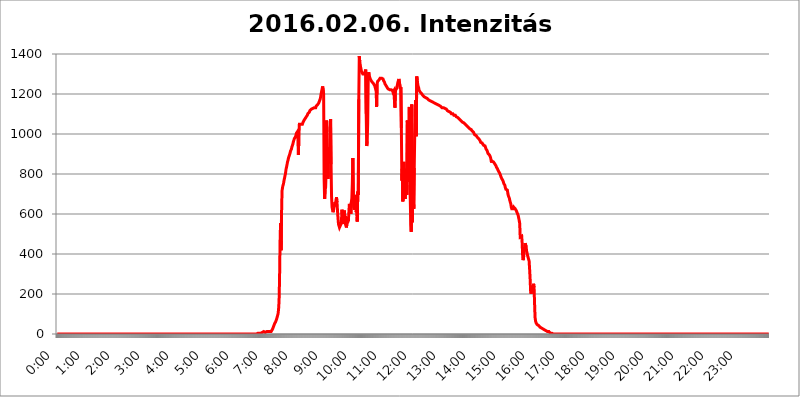
| Category | 2016.02.06. Intenzitás [W/m^2] |
|---|---|
| 0.0 | 0 |
| 0.0006944444444444445 | 0 |
| 0.001388888888888889 | 0 |
| 0.0020833333333333333 | 0 |
| 0.002777777777777778 | 0 |
| 0.003472222222222222 | 0 |
| 0.004166666666666667 | 0 |
| 0.004861111111111111 | 0 |
| 0.005555555555555556 | 0 |
| 0.0062499999999999995 | 0 |
| 0.006944444444444444 | 0 |
| 0.007638888888888889 | 0 |
| 0.008333333333333333 | 0 |
| 0.009027777777777779 | 0 |
| 0.009722222222222222 | 0 |
| 0.010416666666666666 | 0 |
| 0.011111111111111112 | 0 |
| 0.011805555555555555 | 0 |
| 0.012499999999999999 | 0 |
| 0.013194444444444444 | 0 |
| 0.013888888888888888 | 0 |
| 0.014583333333333332 | 0 |
| 0.015277777777777777 | 0 |
| 0.015972222222222224 | 0 |
| 0.016666666666666666 | 0 |
| 0.017361111111111112 | 0 |
| 0.018055555555555557 | 0 |
| 0.01875 | 0 |
| 0.019444444444444445 | 0 |
| 0.02013888888888889 | 0 |
| 0.020833333333333332 | 0 |
| 0.02152777777777778 | 0 |
| 0.022222222222222223 | 0 |
| 0.02291666666666667 | 0 |
| 0.02361111111111111 | 0 |
| 0.024305555555555556 | 0 |
| 0.024999999999999998 | 0 |
| 0.025694444444444447 | 0 |
| 0.02638888888888889 | 0 |
| 0.027083333333333334 | 0 |
| 0.027777777777777776 | 0 |
| 0.02847222222222222 | 0 |
| 0.029166666666666664 | 0 |
| 0.029861111111111113 | 0 |
| 0.030555555555555555 | 0 |
| 0.03125 | 0 |
| 0.03194444444444445 | 0 |
| 0.03263888888888889 | 0 |
| 0.03333333333333333 | 0 |
| 0.034027777777777775 | 0 |
| 0.034722222222222224 | 0 |
| 0.035416666666666666 | 0 |
| 0.036111111111111115 | 0 |
| 0.03680555555555556 | 0 |
| 0.0375 | 0 |
| 0.03819444444444444 | 0 |
| 0.03888888888888889 | 0 |
| 0.03958333333333333 | 0 |
| 0.04027777777777778 | 0 |
| 0.04097222222222222 | 0 |
| 0.041666666666666664 | 0 |
| 0.042361111111111106 | 0 |
| 0.04305555555555556 | 0 |
| 0.043750000000000004 | 0 |
| 0.044444444444444446 | 0 |
| 0.04513888888888889 | 0 |
| 0.04583333333333334 | 0 |
| 0.04652777777777778 | 0 |
| 0.04722222222222222 | 0 |
| 0.04791666666666666 | 0 |
| 0.04861111111111111 | 0 |
| 0.049305555555555554 | 0 |
| 0.049999999999999996 | 0 |
| 0.05069444444444445 | 0 |
| 0.051388888888888894 | 0 |
| 0.052083333333333336 | 0 |
| 0.05277777777777778 | 0 |
| 0.05347222222222222 | 0 |
| 0.05416666666666667 | 0 |
| 0.05486111111111111 | 0 |
| 0.05555555555555555 | 0 |
| 0.05625 | 0 |
| 0.05694444444444444 | 0 |
| 0.057638888888888885 | 0 |
| 0.05833333333333333 | 0 |
| 0.05902777777777778 | 0 |
| 0.059722222222222225 | 0 |
| 0.06041666666666667 | 0 |
| 0.061111111111111116 | 0 |
| 0.06180555555555556 | 0 |
| 0.0625 | 0 |
| 0.06319444444444444 | 0 |
| 0.06388888888888888 | 0 |
| 0.06458333333333334 | 0 |
| 0.06527777777777778 | 0 |
| 0.06597222222222222 | 0 |
| 0.06666666666666667 | 0 |
| 0.06736111111111111 | 0 |
| 0.06805555555555555 | 0 |
| 0.06874999999999999 | 0 |
| 0.06944444444444443 | 0 |
| 0.07013888888888889 | 0 |
| 0.07083333333333333 | 0 |
| 0.07152777777777779 | 0 |
| 0.07222222222222223 | 0 |
| 0.07291666666666667 | 0 |
| 0.07361111111111111 | 0 |
| 0.07430555555555556 | 0 |
| 0.075 | 0 |
| 0.07569444444444444 | 0 |
| 0.0763888888888889 | 0 |
| 0.07708333333333334 | 0 |
| 0.07777777777777778 | 0 |
| 0.07847222222222222 | 0 |
| 0.07916666666666666 | 0 |
| 0.0798611111111111 | 0 |
| 0.08055555555555556 | 0 |
| 0.08125 | 0 |
| 0.08194444444444444 | 0 |
| 0.08263888888888889 | 0 |
| 0.08333333333333333 | 0 |
| 0.08402777777777777 | 0 |
| 0.08472222222222221 | 0 |
| 0.08541666666666665 | 0 |
| 0.08611111111111112 | 0 |
| 0.08680555555555557 | 0 |
| 0.08750000000000001 | 0 |
| 0.08819444444444445 | 0 |
| 0.08888888888888889 | 0 |
| 0.08958333333333333 | 0 |
| 0.09027777777777778 | 0 |
| 0.09097222222222222 | 0 |
| 0.09166666666666667 | 0 |
| 0.09236111111111112 | 0 |
| 0.09305555555555556 | 0 |
| 0.09375 | 0 |
| 0.09444444444444444 | 0 |
| 0.09513888888888888 | 0 |
| 0.09583333333333333 | 0 |
| 0.09652777777777777 | 0 |
| 0.09722222222222222 | 0 |
| 0.09791666666666667 | 0 |
| 0.09861111111111111 | 0 |
| 0.09930555555555555 | 0 |
| 0.09999999999999999 | 0 |
| 0.10069444444444443 | 0 |
| 0.1013888888888889 | 0 |
| 0.10208333333333335 | 0 |
| 0.10277777777777779 | 0 |
| 0.10347222222222223 | 0 |
| 0.10416666666666667 | 0 |
| 0.10486111111111111 | 0 |
| 0.10555555555555556 | 0 |
| 0.10625 | 0 |
| 0.10694444444444444 | 0 |
| 0.1076388888888889 | 0 |
| 0.10833333333333334 | 0 |
| 0.10902777777777778 | 0 |
| 0.10972222222222222 | 0 |
| 0.1111111111111111 | 0 |
| 0.11180555555555556 | 0 |
| 0.11180555555555556 | 0 |
| 0.1125 | 0 |
| 0.11319444444444444 | 0 |
| 0.11388888888888889 | 0 |
| 0.11458333333333333 | 0 |
| 0.11527777777777777 | 0 |
| 0.11597222222222221 | 0 |
| 0.11666666666666665 | 0 |
| 0.1173611111111111 | 0 |
| 0.11805555555555557 | 0 |
| 0.11944444444444445 | 0 |
| 0.12013888888888889 | 0 |
| 0.12083333333333333 | 0 |
| 0.12152777777777778 | 0 |
| 0.12222222222222223 | 0 |
| 0.12291666666666667 | 0 |
| 0.12291666666666667 | 0 |
| 0.12361111111111112 | 0 |
| 0.12430555555555556 | 0 |
| 0.125 | 0 |
| 0.12569444444444444 | 0 |
| 0.12638888888888888 | 0 |
| 0.12708333333333333 | 0 |
| 0.16875 | 0 |
| 0.12847222222222224 | 0 |
| 0.12916666666666668 | 0 |
| 0.12986111111111112 | 0 |
| 0.13055555555555556 | 0 |
| 0.13125 | 0 |
| 0.13194444444444445 | 0 |
| 0.1326388888888889 | 0 |
| 0.13333333333333333 | 0 |
| 0.13402777777777777 | 0 |
| 0.13402777777777777 | 0 |
| 0.13472222222222222 | 0 |
| 0.13541666666666666 | 0 |
| 0.1361111111111111 | 0 |
| 0.13749999999999998 | 0 |
| 0.13819444444444443 | 0 |
| 0.1388888888888889 | 0 |
| 0.13958333333333334 | 0 |
| 0.14027777777777778 | 0 |
| 0.14097222222222222 | 0 |
| 0.14166666666666666 | 0 |
| 0.1423611111111111 | 0 |
| 0.14305555555555557 | 0 |
| 0.14375000000000002 | 0 |
| 0.14444444444444446 | 0 |
| 0.1451388888888889 | 0 |
| 0.1451388888888889 | 0 |
| 0.14652777777777778 | 0 |
| 0.14722222222222223 | 0 |
| 0.14791666666666667 | 0 |
| 0.1486111111111111 | 0 |
| 0.14930555555555555 | 0 |
| 0.15 | 0 |
| 0.15069444444444444 | 0 |
| 0.15138888888888888 | 0 |
| 0.15208333333333332 | 0 |
| 0.15277777777777776 | 0 |
| 0.15347222222222223 | 0 |
| 0.15416666666666667 | 0 |
| 0.15486111111111112 | 0 |
| 0.15555555555555556 | 0 |
| 0.15625 | 0 |
| 0.15694444444444444 | 0 |
| 0.15763888888888888 | 0 |
| 0.15833333333333333 | 0 |
| 0.15902777777777777 | 0 |
| 0.15972222222222224 | 0 |
| 0.16041666666666668 | 0 |
| 0.16111111111111112 | 0 |
| 0.16180555555555556 | 0 |
| 0.1625 | 0 |
| 0.16319444444444445 | 0 |
| 0.1638888888888889 | 0 |
| 0.16458333333333333 | 0 |
| 0.16527777777777777 | 0 |
| 0.16597222222222222 | 0 |
| 0.16666666666666666 | 0 |
| 0.1673611111111111 | 0 |
| 0.16805555555555554 | 0 |
| 0.16874999999999998 | 0 |
| 0.16944444444444443 | 0 |
| 0.17013888888888887 | 0 |
| 0.1708333333333333 | 0 |
| 0.17152777777777775 | 0 |
| 0.17222222222222225 | 0 |
| 0.1729166666666667 | 0 |
| 0.17361111111111113 | 0 |
| 0.17430555555555557 | 0 |
| 0.17500000000000002 | 0 |
| 0.17569444444444446 | 0 |
| 0.1763888888888889 | 0 |
| 0.17708333333333334 | 0 |
| 0.17777777777777778 | 0 |
| 0.17847222222222223 | 0 |
| 0.17916666666666667 | 0 |
| 0.1798611111111111 | 0 |
| 0.18055555555555555 | 0 |
| 0.18125 | 0 |
| 0.18194444444444444 | 0 |
| 0.1826388888888889 | 0 |
| 0.18333333333333335 | 0 |
| 0.1840277777777778 | 0 |
| 0.18472222222222223 | 0 |
| 0.18541666666666667 | 0 |
| 0.18611111111111112 | 0 |
| 0.18680555555555556 | 0 |
| 0.1875 | 0 |
| 0.18819444444444444 | 0 |
| 0.18888888888888888 | 0 |
| 0.18958333333333333 | 0 |
| 0.19027777777777777 | 0 |
| 0.1909722222222222 | 0 |
| 0.19166666666666665 | 0 |
| 0.19236111111111112 | 0 |
| 0.19305555555555554 | 0 |
| 0.19375 | 0 |
| 0.19444444444444445 | 0 |
| 0.1951388888888889 | 0 |
| 0.19583333333333333 | 0 |
| 0.19652777777777777 | 0 |
| 0.19722222222222222 | 0 |
| 0.19791666666666666 | 0 |
| 0.1986111111111111 | 0 |
| 0.19930555555555554 | 0 |
| 0.19999999999999998 | 0 |
| 0.20069444444444443 | 0 |
| 0.20138888888888887 | 0 |
| 0.2020833333333333 | 0 |
| 0.2027777777777778 | 0 |
| 0.2034722222222222 | 0 |
| 0.2041666666666667 | 0 |
| 0.20486111111111113 | 0 |
| 0.20555555555555557 | 0 |
| 0.20625000000000002 | 0 |
| 0.20694444444444446 | 0 |
| 0.2076388888888889 | 0 |
| 0.20833333333333334 | 0 |
| 0.20902777777777778 | 0 |
| 0.20972222222222223 | 0 |
| 0.21041666666666667 | 0 |
| 0.2111111111111111 | 0 |
| 0.21180555555555555 | 0 |
| 0.2125 | 0 |
| 0.21319444444444444 | 0 |
| 0.2138888888888889 | 0 |
| 0.21458333333333335 | 0 |
| 0.2152777777777778 | 0 |
| 0.21597222222222223 | 0 |
| 0.21666666666666667 | 0 |
| 0.21736111111111112 | 0 |
| 0.21805555555555556 | 0 |
| 0.21875 | 0 |
| 0.21944444444444444 | 0 |
| 0.22013888888888888 | 0 |
| 0.22083333333333333 | 0 |
| 0.22152777777777777 | 0 |
| 0.2222222222222222 | 0 |
| 0.22291666666666665 | 0 |
| 0.2236111111111111 | 0 |
| 0.22430555555555556 | 0 |
| 0.225 | 0 |
| 0.22569444444444445 | 0 |
| 0.2263888888888889 | 0 |
| 0.22708333333333333 | 0 |
| 0.22777777777777777 | 0 |
| 0.22847222222222222 | 0 |
| 0.22916666666666666 | 0 |
| 0.2298611111111111 | 0 |
| 0.23055555555555554 | 0 |
| 0.23124999999999998 | 0 |
| 0.23194444444444443 | 0 |
| 0.23263888888888887 | 0 |
| 0.2333333333333333 | 0 |
| 0.2340277777777778 | 0 |
| 0.2347222222222222 | 0 |
| 0.2354166666666667 | 0 |
| 0.23611111111111113 | 0 |
| 0.23680555555555557 | 0 |
| 0.23750000000000002 | 0 |
| 0.23819444444444446 | 0 |
| 0.2388888888888889 | 0 |
| 0.23958333333333334 | 0 |
| 0.24027777777777778 | 0 |
| 0.24097222222222223 | 0 |
| 0.24166666666666667 | 0 |
| 0.2423611111111111 | 0 |
| 0.24305555555555555 | 0 |
| 0.24375 | 0 |
| 0.24444444444444446 | 0 |
| 0.24513888888888888 | 0 |
| 0.24583333333333335 | 0 |
| 0.2465277777777778 | 0 |
| 0.24722222222222223 | 0 |
| 0.24791666666666667 | 0 |
| 0.24861111111111112 | 0 |
| 0.24930555555555556 | 0 |
| 0.25 | 0 |
| 0.25069444444444444 | 0 |
| 0.2513888888888889 | 0 |
| 0.2520833333333333 | 0 |
| 0.25277777777777777 | 0 |
| 0.2534722222222222 | 0 |
| 0.25416666666666665 | 0 |
| 0.2548611111111111 | 0 |
| 0.2555555555555556 | 0 |
| 0.25625000000000003 | 0 |
| 0.2569444444444445 | 0 |
| 0.2576388888888889 | 0 |
| 0.25833333333333336 | 0 |
| 0.2590277777777778 | 0 |
| 0.25972222222222224 | 0 |
| 0.2604166666666667 | 0 |
| 0.2611111111111111 | 0 |
| 0.26180555555555557 | 0 |
| 0.2625 | 0 |
| 0.26319444444444445 | 0 |
| 0.2638888888888889 | 0 |
| 0.26458333333333334 | 0 |
| 0.2652777777777778 | 0 |
| 0.2659722222222222 | 0 |
| 0.26666666666666666 | 0 |
| 0.2673611111111111 | 0 |
| 0.26805555555555555 | 0 |
| 0.26875 | 0 |
| 0.26944444444444443 | 0 |
| 0.2701388888888889 | 0 |
| 0.2708333333333333 | 0 |
| 0.27152777777777776 | 0 |
| 0.2722222222222222 | 0 |
| 0.27291666666666664 | 0 |
| 0.2736111111111111 | 0 |
| 0.2743055555555555 | 0 |
| 0.27499999999999997 | 0 |
| 0.27569444444444446 | 0 |
| 0.27638888888888885 | 0 |
| 0.27708333333333335 | 0 |
| 0.2777777777777778 | 0 |
| 0.27847222222222223 | 0 |
| 0.2791666666666667 | 0 |
| 0.2798611111111111 | 0 |
| 0.28055555555555556 | 0 |
| 0.28125 | 3.525 |
| 0.28194444444444444 | 3.525 |
| 0.2826388888888889 | 3.525 |
| 0.2833333333333333 | 3.525 |
| 0.28402777777777777 | 3.525 |
| 0.2847222222222222 | 3.525 |
| 0.28541666666666665 | 3.525 |
| 0.28611111111111115 | 3.525 |
| 0.28680555555555554 | 3.525 |
| 0.28750000000000003 | 7.887 |
| 0.2881944444444445 | 7.887 |
| 0.2888888888888889 | 12.257 |
| 0.28958333333333336 | 12.257 |
| 0.2902777777777778 | 12.257 |
| 0.29097222222222224 | 7.887 |
| 0.2916666666666667 | 7.887 |
| 0.2923611111111111 | 12.257 |
| 0.29305555555555557 | 7.887 |
| 0.29375 | 12.257 |
| 0.29444444444444445 | 12.257 |
| 0.2951388888888889 | 12.257 |
| 0.29583333333333334 | 12.257 |
| 0.2965277777777778 | 12.257 |
| 0.2972222222222222 | 12.257 |
| 0.29791666666666666 | 12.257 |
| 0.2986111111111111 | 12.257 |
| 0.29930555555555555 | 12.257 |
| 0.3 | 12.257 |
| 0.30069444444444443 | 16.636 |
| 0.3013888888888889 | 16.636 |
| 0.3020833333333333 | 25.419 |
| 0.30277777777777776 | 29.823 |
| 0.3034722222222222 | 38.653 |
| 0.30416666666666664 | 43.079 |
| 0.3048611111111111 | 51.951 |
| 0.3055555555555555 | 56.398 |
| 0.30624999999999997 | 60.85 |
| 0.3069444444444444 | 65.31 |
| 0.3076388888888889 | 74.246 |
| 0.30833333333333335 | 83.205 |
| 0.3090277777777778 | 92.184 |
| 0.30972222222222223 | 101.184 |
| 0.3104166666666667 | 123.758 |
| 0.3111111111111111 | 164.605 |
| 0.31180555555555556 | 278.603 |
| 0.3125 | 458.38 |
| 0.31319444444444444 | 553.986 |
| 0.3138888888888889 | 418.492 |
| 0.3145833333333333 | 600.661 |
| 0.31527777777777777 | 715.858 |
| 0.3159722222222222 | 731.896 |
| 0.31666666666666665 | 743.859 |
| 0.31736111111111115 | 751.803 |
| 0.31805555555555554 | 767.62 |
| 0.31875000000000003 | 779.42 |
| 0.3194444444444445 | 791.169 |
| 0.3201388888888889 | 802.868 |
| 0.32083333333333336 | 822.26 |
| 0.3215277777777778 | 833.834 |
| 0.32222222222222224 | 845.365 |
| 0.3229166666666667 | 860.676 |
| 0.3236111111111111 | 868.305 |
| 0.32430555555555557 | 879.719 |
| 0.325 | 887.309 |
| 0.32569444444444445 | 894.885 |
| 0.3263888888888889 | 902.447 |
| 0.32708333333333334 | 913.766 |
| 0.3277777777777778 | 917.534 |
| 0.3284722222222222 | 925.06 |
| 0.32916666666666666 | 936.33 |
| 0.3298611111111111 | 943.832 |
| 0.33055555555555555 | 951.327 |
| 0.33125 | 962.555 |
| 0.33194444444444443 | 966.295 |
| 0.3326388888888889 | 977.508 |
| 0.3333333333333333 | 981.244 |
| 0.3340277777777778 | 984.98 |
| 0.3347222222222222 | 992.448 |
| 0.3354166666666667 | 1003.65 |
| 0.3361111111111111 | 999.916 |
| 0.3368055555555556 | 1011.118 |
| 0.33749999999999997 | 981.244 |
| 0.33819444444444446 | 894.885 |
| 0.33888888888888885 | 984.98 |
| 0.33958333333333335 | 1048.508 |
| 0.34027777777777773 | 1044.762 |
| 0.34097222222222223 | 1044.762 |
| 0.3416666666666666 | 1048.508 |
| 0.3423611111111111 | 1048.508 |
| 0.3430555555555555 | 1048.508 |
| 0.34375 | 1048.508 |
| 0.3444444444444445 | 1056.004 |
| 0.3451388888888889 | 1059.756 |
| 0.3458333333333334 | 1059.756 |
| 0.34652777777777777 | 1071.027 |
| 0.34722222222222227 | 1071.027 |
| 0.34791666666666665 | 1078.555 |
| 0.34861111111111115 | 1082.324 |
| 0.34930555555555554 | 1086.097 |
| 0.35000000000000003 | 1089.873 |
| 0.3506944444444444 | 1093.653 |
| 0.3513888888888889 | 1101.226 |
| 0.3520833333333333 | 1101.226 |
| 0.3527777777777778 | 1105.019 |
| 0.3534722222222222 | 1108.816 |
| 0.3541666666666667 | 1116.426 |
| 0.3548611111111111 | 1116.426 |
| 0.35555555555555557 | 1120.238 |
| 0.35625 | 1124.056 |
| 0.35694444444444445 | 1124.056 |
| 0.3576388888888889 | 1127.879 |
| 0.35833333333333334 | 1127.879 |
| 0.3590277777777778 | 1131.708 |
| 0.3597222222222222 | 1127.879 |
| 0.36041666666666666 | 1131.708 |
| 0.3611111111111111 | 1131.708 |
| 0.36180555555555555 | 1135.543 |
| 0.3625 | 1131.708 |
| 0.36319444444444443 | 1139.384 |
| 0.3638888888888889 | 1143.232 |
| 0.3645833333333333 | 1143.232 |
| 0.3652777777777778 | 1147.086 |
| 0.3659722222222222 | 1150.946 |
| 0.3666666666666667 | 1154.814 |
| 0.3673611111111111 | 1158.689 |
| 0.3680555555555556 | 1158.689 |
| 0.36874999999999997 | 1174.263 |
| 0.36944444444444446 | 1186.03 |
| 0.37013888888888885 | 1201.843 |
| 0.37083333333333335 | 1213.804 |
| 0.37152777777777773 | 1225.859 |
| 0.37222222222222223 | 1238.014 |
| 0.3729166666666666 | 1242.089 |
| 0.3736111111111111 | 1201.843 |
| 0.3743055555555555 | 775.492 |
| 0.375 | 675.311 |
| 0.3756944444444445 | 719.877 |
| 0.3763888888888889 | 731.896 |
| 0.3770833333333334 | 810.641 |
| 0.37777777777777777 | 1067.267 |
| 0.37847222222222227 | 1011.118 |
| 0.37916666666666665 | 833.834 |
| 0.37986111111111115 | 775.492 |
| 0.38055555555555554 | 906.223 |
| 0.38125000000000003 | 921.298 |
| 0.3819444444444444 | 932.576 |
| 0.3826388888888889 | 898.668 |
| 0.3833333333333333 | 1074.789 |
| 0.3840277777777778 | 849.199 |
| 0.3847222222222222 | 687.544 |
| 0.3854166666666667 | 634.105 |
| 0.3861111111111111 | 621.613 |
| 0.38680555555555557 | 609.062 |
| 0.3875 | 617.436 |
| 0.38819444444444445 | 634.105 |
| 0.3888888888888889 | 646.537 |
| 0.38958333333333334 | 658.909 |
| 0.3902777777777778 | 638.256 |
| 0.3909722222222222 | 642.4 |
| 0.39166666666666666 | 683.473 |
| 0.3923611111111111 | 658.909 |
| 0.39305555555555555 | 617.436 |
| 0.39375 | 579.542 |
| 0.39444444444444443 | 549.704 |
| 0.3951388888888889 | 541.121 |
| 0.3958333333333333 | 532.513 |
| 0.3965277777777778 | 528.2 |
| 0.3972222222222222 | 532.513 |
| 0.3979166666666667 | 549.704 |
| 0.3986111111111111 | 562.53 |
| 0.3993055555555556 | 621.613 |
| 0.39999999999999997 | 596.45 |
| 0.40069444444444446 | 562.53 |
| 0.40138888888888885 | 549.704 |
| 0.40208333333333335 | 558.261 |
| 0.40277777777777773 | 617.436 |
| 0.40347222222222223 | 571.049 |
| 0.4041666666666666 | 588.009 |
| 0.4048611111111111 | 541.121 |
| 0.4055555555555555 | 532.513 |
| 0.40625 | 549.704 |
| 0.4069444444444445 | 549.704 |
| 0.4076388888888889 | 549.704 |
| 0.4083333333333334 | 566.793 |
| 0.40902777777777777 | 609.062 |
| 0.40972222222222227 | 650.667 |
| 0.41041666666666665 | 629.948 |
| 0.41111111111111115 | 613.252 |
| 0.41180555555555554 | 600.661 |
| 0.41250000000000003 | 658.909 |
| 0.4131944444444444 | 679.395 |
| 0.4138888888888889 | 755.766 |
| 0.4145833333333333 | 879.719 |
| 0.4152777777777778 | 687.544 |
| 0.4159722222222222 | 634.105 |
| 0.4166666666666667 | 621.613 |
| 0.4173611111111111 | 621.613 |
| 0.41805555555555557 | 650.667 |
| 0.41875 | 695.666 |
| 0.41944444444444445 | 609.062 |
| 0.4201388888888889 | 642.4 |
| 0.42083333333333334 | 562.53 |
| 0.4215277777777778 | 711.832 |
| 0.4222222222222222 | 695.666 |
| 0.42291666666666666 | 1174.263 |
| 0.4236111111111111 | 1389.456 |
| 0.42430555555555555 | 1361.991 |
| 0.425 | 1344.072 |
| 0.42569444444444443 | 1330.826 |
| 0.4263888888888889 | 1317.736 |
| 0.4270833333333333 | 1309.093 |
| 0.4277777777777778 | 1304.795 |
| 0.4284722222222222 | 1300.514 |
| 0.4291666666666667 | 1296.248 |
| 0.4298611111111111 | 1296.248 |
| 0.4305555555555556 | 1300.514 |
| 0.43124999999999997 | 1304.795 |
| 0.43194444444444446 | 1313.406 |
| 0.43263888888888885 | 1322.082 |
| 0.43333333333333335 | 1101.226 |
| 0.43402777777777773 | 940.082 |
| 0.43472222222222223 | 962.555 |
| 0.4354166666666666 | 1056.004 |
| 0.4361111111111111 | 1266.8 |
| 0.4368055555555555 | 1309.093 |
| 0.4375 | 1291.997 |
| 0.4381944444444445 | 1283.541 |
| 0.4388888888888889 | 1279.334 |
| 0.4395833333333334 | 1270.964 |
| 0.44027777777777777 | 1266.8 |
| 0.44097222222222227 | 1262.649 |
| 0.44166666666666665 | 1258.511 |
| 0.44236111111111115 | 1258.511 |
| 0.44305555555555554 | 1254.387 |
| 0.44375000000000003 | 1250.275 |
| 0.4444444444444444 | 1250.275 |
| 0.4451388888888889 | 1242.089 |
| 0.4458333333333333 | 1233.951 |
| 0.4465277777777778 | 1242.089 |
| 0.4472222222222222 | 1225.859 |
| 0.4479166666666667 | 1135.543 |
| 0.4486111111111111 | 1250.275 |
| 0.44930555555555557 | 1262.649 |
| 0.45 | 1262.649 |
| 0.45069444444444445 | 1266.8 |
| 0.4513888888888889 | 1270.964 |
| 0.45208333333333334 | 1275.142 |
| 0.4527777777777778 | 1279.334 |
| 0.4534722222222222 | 1279.334 |
| 0.45416666666666666 | 1279.334 |
| 0.4548611111111111 | 1279.334 |
| 0.45555555555555555 | 1275.142 |
| 0.45625 | 1275.142 |
| 0.45694444444444443 | 1275.142 |
| 0.4576388888888889 | 1266.8 |
| 0.4583333333333333 | 1266.8 |
| 0.4590277777777778 | 1258.511 |
| 0.4597222222222222 | 1250.275 |
| 0.4604166666666667 | 1246.176 |
| 0.4611111111111111 | 1242.089 |
| 0.4618055555555556 | 1238.014 |
| 0.46249999999999997 | 1233.951 |
| 0.46319444444444446 | 1229.899 |
| 0.46388888888888885 | 1225.859 |
| 0.46458333333333335 | 1225.859 |
| 0.46527777777777773 | 1225.859 |
| 0.46597222222222223 | 1221.83 |
| 0.4666666666666666 | 1221.83 |
| 0.4673611111111111 | 1221.83 |
| 0.4680555555555555 | 1221.83 |
| 0.46875 | 1217.812 |
| 0.4694444444444445 | 1217.812 |
| 0.4701388888888889 | 1217.812 |
| 0.4708333333333334 | 1209.807 |
| 0.47152777777777777 | 1213.804 |
| 0.47222222222222227 | 1217.812 |
| 0.47291666666666665 | 1166.46 |
| 0.47361111111111115 | 1131.708 |
| 0.47430555555555554 | 1217.812 |
| 0.47500000000000003 | 1213.804 |
| 0.4756944444444444 | 1225.859 |
| 0.4763888888888889 | 1233.951 |
| 0.4770833333333333 | 1246.176 |
| 0.4777777777777778 | 1258.511 |
| 0.4784722222222222 | 1266.8 |
| 0.4791666666666667 | 1275.142 |
| 0.4798611111111111 | 1279.334 |
| 0.48055555555555557 | 1270.964 |
| 0.48125 | 1225.859 |
| 0.48194444444444445 | 1233.951 |
| 0.4826388888888889 | 1029.798 |
| 0.48333333333333334 | 767.62 |
| 0.4840277777777778 | 826.123 |
| 0.4847222222222222 | 663.019 |
| 0.48541666666666666 | 743.859 |
| 0.4861111111111111 | 860.676 |
| 0.48680555555555555 | 695.666 |
| 0.4875 | 691.608 |
| 0.48819444444444443 | 675.311 |
| 0.4888888888888889 | 818.392 |
| 0.4895833333333333 | 826.123 |
| 0.4902777777777778 | 695.666 |
| 0.4909722222222222 | 1067.267 |
| 0.4916666666666667 | 1026.06 |
| 0.4923611111111111 | 759.723 |
| 0.4930555555555556 | 947.58 |
| 0.49374999999999997 | 1135.543 |
| 0.49444444444444446 | 783.342 |
| 0.49513888888888885 | 671.22 |
| 0.49583333333333335 | 545.416 |
| 0.49652777777777773 | 510.885 |
| 0.49722222222222223 | 1147.086 |
| 0.4979166666666666 | 558.261 |
| 0.4986111111111111 | 667.123 |
| 0.4993055555555555 | 715.858 |
| 0.5 | 625.784 |
| 0.5006944444444444 | 829.981 |
| 0.5013888888888889 | 996.182 |
| 0.5020833333333333 | 1033.537 |
| 0.5027777777777778 | 1170.358 |
| 0.5034722222222222 | 988.714 |
| 0.5041666666666667 | 1287.761 |
| 0.5048611111111111 | 1270.964 |
| 0.5055555555555555 | 1250.275 |
| 0.50625 | 1238.014 |
| 0.5069444444444444 | 1229.899 |
| 0.5076388888888889 | 1217.812 |
| 0.5083333333333333 | 1213.804 |
| 0.5090277777777777 | 1209.807 |
| 0.5097222222222222 | 1205.82 |
| 0.5104166666666666 | 1205.82 |
| 0.5111111111111112 | 1201.843 |
| 0.5118055555555555 | 1197.876 |
| 0.5125000000000001 | 1193.918 |
| 0.5131944444444444 | 1189.969 |
| 0.513888888888889 | 1189.969 |
| 0.5145833333333333 | 1186.03 |
| 0.5152777777777778 | 1186.03 |
| 0.5159722222222222 | 1186.03 |
| 0.5166666666666667 | 1182.099 |
| 0.517361111111111 | 1178.177 |
| 0.5180555555555556 | 1178.177 |
| 0.5187499999999999 | 1178.177 |
| 0.5194444444444445 | 1178.177 |
| 0.5201388888888888 | 1174.263 |
| 0.5208333333333334 | 1170.358 |
| 0.5215277777777778 | 1170.358 |
| 0.5222222222222223 | 1170.358 |
| 0.5229166666666667 | 1166.46 |
| 0.5236111111111111 | 1162.571 |
| 0.5243055555555556 | 1162.571 |
| 0.525 | 1162.571 |
| 0.5256944444444445 | 1162.571 |
| 0.5263888888888889 | 1158.689 |
| 0.5270833333333333 | 1158.689 |
| 0.5277777777777778 | 1154.814 |
| 0.5284722222222222 | 1154.814 |
| 0.5291666666666667 | 1154.814 |
| 0.5298611111111111 | 1150.946 |
| 0.5305555555555556 | 1150.946 |
| 0.53125 | 1150.946 |
| 0.5319444444444444 | 1147.086 |
| 0.5326388888888889 | 1147.086 |
| 0.5333333333333333 | 1147.086 |
| 0.5340277777777778 | 1147.086 |
| 0.5347222222222222 | 1147.086 |
| 0.5354166666666667 | 1143.232 |
| 0.5361111111111111 | 1143.232 |
| 0.5368055555555555 | 1139.384 |
| 0.5375 | 1139.384 |
| 0.5381944444444444 | 1135.543 |
| 0.5388888888888889 | 1135.543 |
| 0.5395833333333333 | 1131.708 |
| 0.5402777777777777 | 1131.708 |
| 0.5409722222222222 | 1131.708 |
| 0.5416666666666666 | 1131.708 |
| 0.5423611111111112 | 1127.879 |
| 0.5430555555555555 | 1127.879 |
| 0.5437500000000001 | 1127.879 |
| 0.5444444444444444 | 1127.879 |
| 0.545138888888889 | 1124.056 |
| 0.5458333333333333 | 1124.056 |
| 0.5465277777777778 | 1120.238 |
| 0.5472222222222222 | 1116.426 |
| 0.5479166666666667 | 1116.426 |
| 0.548611111111111 | 1116.426 |
| 0.5493055555555556 | 1112.618 |
| 0.5499999999999999 | 1108.816 |
| 0.5506944444444445 | 1108.816 |
| 0.5513888888888888 | 1108.816 |
| 0.5520833333333334 | 1105.019 |
| 0.5527777777777778 | 1101.226 |
| 0.5534722222222223 | 1101.226 |
| 0.5541666666666667 | 1097.437 |
| 0.5548611111111111 | 1101.226 |
| 0.5555555555555556 | 1097.437 |
| 0.55625 | 1093.653 |
| 0.5569444444444445 | 1093.653 |
| 0.5576388888888889 | 1093.653 |
| 0.5583333333333333 | 1093.653 |
| 0.5590277777777778 | 1093.653 |
| 0.5597222222222222 | 1086.097 |
| 0.5604166666666667 | 1086.097 |
| 0.5611111111111111 | 1082.324 |
| 0.5618055555555556 | 1082.324 |
| 0.5625 | 1078.555 |
| 0.5631944444444444 | 1078.555 |
| 0.5638888888888889 | 1074.789 |
| 0.5645833333333333 | 1074.789 |
| 0.5652777777777778 | 1071.027 |
| 0.5659722222222222 | 1067.267 |
| 0.5666666666666667 | 1067.267 |
| 0.5673611111111111 | 1063.51 |
| 0.5680555555555555 | 1059.756 |
| 0.56875 | 1059.756 |
| 0.5694444444444444 | 1056.004 |
| 0.5701388888888889 | 1056.004 |
| 0.5708333333333333 | 1052.255 |
| 0.5715277777777777 | 1052.255 |
| 0.5722222222222222 | 1048.508 |
| 0.5729166666666666 | 1044.762 |
| 0.5736111111111112 | 1044.762 |
| 0.5743055555555555 | 1041.019 |
| 0.5750000000000001 | 1037.277 |
| 0.5756944444444444 | 1037.277 |
| 0.576388888888889 | 1033.537 |
| 0.5770833333333333 | 1033.537 |
| 0.5777777777777778 | 1029.798 |
| 0.5784722222222222 | 1026.06 |
| 0.5791666666666667 | 1022.323 |
| 0.579861111111111 | 1022.323 |
| 0.5805555555555556 | 1022.323 |
| 0.5812499999999999 | 1018.587 |
| 0.5819444444444445 | 1014.852 |
| 0.5826388888888888 | 1011.118 |
| 0.5833333333333334 | 1011.118 |
| 0.5840277777777778 | 1007.383 |
| 0.5847222222222223 | 1003.65 |
| 0.5854166666666667 | 996.182 |
| 0.5861111111111111 | 996.182 |
| 0.5868055555555556 | 992.448 |
| 0.5875 | 992.448 |
| 0.5881944444444445 | 988.714 |
| 0.5888888888888889 | 984.98 |
| 0.5895833333333333 | 984.98 |
| 0.5902777777777778 | 981.244 |
| 0.5909722222222222 | 977.508 |
| 0.5916666666666667 | 973.772 |
| 0.5923611111111111 | 973.772 |
| 0.5930555555555556 | 966.295 |
| 0.59375 | 958.814 |
| 0.5944444444444444 | 962.555 |
| 0.5951388888888889 | 955.071 |
| 0.5958333333333333 | 955.071 |
| 0.5965277777777778 | 955.071 |
| 0.5972222222222222 | 951.327 |
| 0.5979166666666667 | 943.832 |
| 0.5986111111111111 | 940.082 |
| 0.5993055555555555 | 940.082 |
| 0.6 | 940.082 |
| 0.6006944444444444 | 932.576 |
| 0.6013888888888889 | 925.06 |
| 0.6020833333333333 | 925.06 |
| 0.6027777777777777 | 917.534 |
| 0.6034722222222222 | 913.766 |
| 0.6041666666666666 | 902.447 |
| 0.6048611111111112 | 906.223 |
| 0.6055555555555555 | 902.447 |
| 0.6062500000000001 | 894.885 |
| 0.6069444444444444 | 891.099 |
| 0.607638888888889 | 883.516 |
| 0.6083333333333333 | 872.114 |
| 0.6090277777777778 | 856.855 |
| 0.6097222222222222 | 864.493 |
| 0.6104166666666667 | 860.676 |
| 0.611111111111111 | 860.676 |
| 0.6118055555555556 | 860.676 |
| 0.6124999999999999 | 860.676 |
| 0.6131944444444445 | 856.855 |
| 0.6138888888888888 | 849.199 |
| 0.6145833333333334 | 845.365 |
| 0.6152777777777778 | 841.526 |
| 0.6159722222222223 | 833.834 |
| 0.6166666666666667 | 829.981 |
| 0.6173611111111111 | 826.123 |
| 0.6180555555555556 | 822.26 |
| 0.61875 | 814.519 |
| 0.6194444444444445 | 810.641 |
| 0.6201388888888889 | 806.757 |
| 0.6208333333333333 | 802.868 |
| 0.6215277777777778 | 795.074 |
| 0.6222222222222222 | 787.258 |
| 0.6229166666666667 | 783.342 |
| 0.6236111111111111 | 775.492 |
| 0.6243055555555556 | 771.559 |
| 0.625 | 767.62 |
| 0.6256944444444444 | 759.723 |
| 0.6263888888888889 | 751.803 |
| 0.6270833333333333 | 751.803 |
| 0.6277777777777778 | 743.859 |
| 0.6284722222222222 | 731.896 |
| 0.6291666666666667 | 723.889 |
| 0.6298611111111111 | 723.889 |
| 0.6305555555555555 | 719.877 |
| 0.63125 | 719.877 |
| 0.6319444444444444 | 703.762 |
| 0.6326388888888889 | 691.608 |
| 0.6333333333333333 | 691.608 |
| 0.6340277777777777 | 679.395 |
| 0.6347222222222222 | 667.123 |
| 0.6354166666666666 | 658.909 |
| 0.6361111111111112 | 650.667 |
| 0.6368055555555555 | 634.105 |
| 0.6375000000000001 | 625.784 |
| 0.6381944444444444 | 625.784 |
| 0.638888888888889 | 621.613 |
| 0.6395833333333333 | 625.784 |
| 0.6402777777777778 | 634.105 |
| 0.6409722222222222 | 629.948 |
| 0.6416666666666667 | 634.105 |
| 0.642361111111111 | 625.784 |
| 0.6430555555555556 | 621.613 |
| 0.6437499999999999 | 617.436 |
| 0.6444444444444445 | 613.252 |
| 0.6451388888888888 | 604.864 |
| 0.6458333333333334 | 600.661 |
| 0.6465277777777778 | 592.233 |
| 0.6472222222222223 | 579.542 |
| 0.6479166666666667 | 566.793 |
| 0.6486111111111111 | 553.986 |
| 0.6493055555555556 | 484.735 |
| 0.65 | 484.735 |
| 0.6506944444444445 | 489.108 |
| 0.6513888888888889 | 489.108 |
| 0.6520833333333333 | 453.968 |
| 0.6527777777777778 | 387.202 |
| 0.6534722222222222 | 369.23 |
| 0.6541666666666667 | 387.202 |
| 0.6548611111111111 | 414.035 |
| 0.6555555555555556 | 436.27 |
| 0.65625 | 453.968 |
| 0.6569444444444444 | 449.551 |
| 0.6576388888888889 | 436.27 |
| 0.6583333333333333 | 414.035 |
| 0.6590277777777778 | 409.574 |
| 0.6597222222222222 | 391.685 |
| 0.6604166666666667 | 391.685 |
| 0.6611111111111111 | 387.202 |
| 0.6618055555555555 | 364.728 |
| 0.6625 | 324.052 |
| 0.6631944444444444 | 278.603 |
| 0.6638888888888889 | 214.746 |
| 0.6645833333333333 | 201.058 |
| 0.6652777777777777 | 214.746 |
| 0.6659722222222222 | 219.309 |
| 0.6666666666666666 | 219.309 |
| 0.6673611111111111 | 233 |
| 0.6680555555555556 | 251.251 |
| 0.6687500000000001 | 233 |
| 0.6694444444444444 | 155.509 |
| 0.6701388888888888 | 83.205 |
| 0.6708333333333334 | 65.31 |
| 0.6715277777777778 | 56.398 |
| 0.6722222222222222 | 56.398 |
| 0.6729166666666666 | 47.511 |
| 0.6736111111111112 | 47.511 |
| 0.6743055555555556 | 47.511 |
| 0.6749999999999999 | 43.079 |
| 0.6756944444444444 | 38.653 |
| 0.6763888888888889 | 38.653 |
| 0.6770833333333334 | 34.234 |
| 0.6777777777777777 | 29.823 |
| 0.6784722222222223 | 29.823 |
| 0.6791666666666667 | 29.823 |
| 0.6798611111111111 | 25.419 |
| 0.6805555555555555 | 25.419 |
| 0.68125 | 25.419 |
| 0.6819444444444445 | 21.024 |
| 0.6826388888888889 | 21.024 |
| 0.6833333333333332 | 21.024 |
| 0.6840277777777778 | 16.636 |
| 0.6847222222222222 | 16.636 |
| 0.6854166666666667 | 16.636 |
| 0.686111111111111 | 16.636 |
| 0.6868055555555556 | 12.257 |
| 0.6875 | 12.257 |
| 0.6881944444444444 | 12.257 |
| 0.688888888888889 | 12.257 |
| 0.6895833333333333 | 12.257 |
| 0.6902777777777778 | 7.887 |
| 0.6909722222222222 | 7.887 |
| 0.6916666666666668 | 3.525 |
| 0.6923611111111111 | 3.525 |
| 0.6930555555555555 | 3.525 |
| 0.69375 | 3.525 |
| 0.6944444444444445 | 3.525 |
| 0.6951388888888889 | 3.525 |
| 0.6958333333333333 | 0 |
| 0.6965277777777777 | 3.525 |
| 0.6972222222222223 | 0 |
| 0.6979166666666666 | 0 |
| 0.6986111111111111 | 0 |
| 0.6993055555555556 | 0 |
| 0.7000000000000001 | 0 |
| 0.7006944444444444 | 0 |
| 0.7013888888888888 | 0 |
| 0.7020833333333334 | 0 |
| 0.7027777777777778 | 0 |
| 0.7034722222222222 | 0 |
| 0.7041666666666666 | 0 |
| 0.7048611111111112 | 0 |
| 0.7055555555555556 | 0 |
| 0.7062499999999999 | 0 |
| 0.7069444444444444 | 0 |
| 0.7076388888888889 | 0 |
| 0.7083333333333334 | 0 |
| 0.7090277777777777 | 0 |
| 0.7097222222222223 | 0 |
| 0.7104166666666667 | 0 |
| 0.7111111111111111 | 0 |
| 0.7118055555555555 | 0 |
| 0.7125 | 0 |
| 0.7131944444444445 | 0 |
| 0.7138888888888889 | 0 |
| 0.7145833333333332 | 0 |
| 0.7152777777777778 | 0 |
| 0.7159722222222222 | 0 |
| 0.7166666666666667 | 0 |
| 0.717361111111111 | 0 |
| 0.7180555555555556 | 0 |
| 0.71875 | 0 |
| 0.7194444444444444 | 0 |
| 0.720138888888889 | 0 |
| 0.7208333333333333 | 0 |
| 0.7215277777777778 | 0 |
| 0.7222222222222222 | 0 |
| 0.7229166666666668 | 0 |
| 0.7236111111111111 | 0 |
| 0.7243055555555555 | 0 |
| 0.725 | 0 |
| 0.7256944444444445 | 0 |
| 0.7263888888888889 | 0 |
| 0.7270833333333333 | 0 |
| 0.7277777777777777 | 0 |
| 0.7284722222222223 | 0 |
| 0.7291666666666666 | 0 |
| 0.7298611111111111 | 0 |
| 0.7305555555555556 | 0 |
| 0.7312500000000001 | 0 |
| 0.7319444444444444 | 0 |
| 0.7326388888888888 | 0 |
| 0.7333333333333334 | 0 |
| 0.7340277777777778 | 0 |
| 0.7347222222222222 | 0 |
| 0.7354166666666666 | 0 |
| 0.7361111111111112 | 0 |
| 0.7368055555555556 | 0 |
| 0.7374999999999999 | 0 |
| 0.7381944444444444 | 0 |
| 0.7388888888888889 | 0 |
| 0.7395833333333334 | 0 |
| 0.7402777777777777 | 0 |
| 0.7409722222222223 | 0 |
| 0.7416666666666667 | 0 |
| 0.7423611111111111 | 0 |
| 0.7430555555555555 | 0 |
| 0.74375 | 0 |
| 0.7444444444444445 | 0 |
| 0.7451388888888889 | 0 |
| 0.7458333333333332 | 0 |
| 0.7465277777777778 | 0 |
| 0.7472222222222222 | 0 |
| 0.7479166666666667 | 0 |
| 0.748611111111111 | 0 |
| 0.7493055555555556 | 0 |
| 0.75 | 0 |
| 0.7506944444444444 | 0 |
| 0.751388888888889 | 0 |
| 0.7520833333333333 | 0 |
| 0.7527777777777778 | 0 |
| 0.7534722222222222 | 0 |
| 0.7541666666666668 | 0 |
| 0.7548611111111111 | 0 |
| 0.7555555555555555 | 0 |
| 0.75625 | 0 |
| 0.7569444444444445 | 0 |
| 0.7576388888888889 | 0 |
| 0.7583333333333333 | 0 |
| 0.7590277777777777 | 0 |
| 0.7597222222222223 | 0 |
| 0.7604166666666666 | 0 |
| 0.7611111111111111 | 0 |
| 0.7618055555555556 | 0 |
| 0.7625000000000001 | 0 |
| 0.7631944444444444 | 0 |
| 0.7638888888888888 | 0 |
| 0.7645833333333334 | 0 |
| 0.7652777777777778 | 0 |
| 0.7659722222222222 | 0 |
| 0.7666666666666666 | 0 |
| 0.7673611111111112 | 0 |
| 0.7680555555555556 | 0 |
| 0.7687499999999999 | 0 |
| 0.7694444444444444 | 0 |
| 0.7701388888888889 | 0 |
| 0.7708333333333334 | 0 |
| 0.7715277777777777 | 0 |
| 0.7722222222222223 | 0 |
| 0.7729166666666667 | 0 |
| 0.7736111111111111 | 0 |
| 0.7743055555555555 | 0 |
| 0.775 | 0 |
| 0.7756944444444445 | 0 |
| 0.7763888888888889 | 0 |
| 0.7770833333333332 | 0 |
| 0.7777777777777778 | 0 |
| 0.7784722222222222 | 0 |
| 0.7791666666666667 | 0 |
| 0.779861111111111 | 0 |
| 0.7805555555555556 | 0 |
| 0.78125 | 0 |
| 0.7819444444444444 | 0 |
| 0.782638888888889 | 0 |
| 0.7833333333333333 | 0 |
| 0.7840277777777778 | 0 |
| 0.7847222222222222 | 0 |
| 0.7854166666666668 | 0 |
| 0.7861111111111111 | 0 |
| 0.7868055555555555 | 0 |
| 0.7875 | 0 |
| 0.7881944444444445 | 0 |
| 0.7888888888888889 | 0 |
| 0.7895833333333333 | 0 |
| 0.7902777777777777 | 0 |
| 0.7909722222222223 | 0 |
| 0.7916666666666666 | 0 |
| 0.7923611111111111 | 0 |
| 0.7930555555555556 | 0 |
| 0.7937500000000001 | 0 |
| 0.7944444444444444 | 0 |
| 0.7951388888888888 | 0 |
| 0.7958333333333334 | 0 |
| 0.7965277777777778 | 0 |
| 0.7972222222222222 | 0 |
| 0.7979166666666666 | 0 |
| 0.7986111111111112 | 0 |
| 0.7993055555555556 | 0 |
| 0.7999999999999999 | 0 |
| 0.8006944444444444 | 0 |
| 0.8013888888888889 | 0 |
| 0.8020833333333334 | 0 |
| 0.8027777777777777 | 0 |
| 0.8034722222222223 | 0 |
| 0.8041666666666667 | 0 |
| 0.8048611111111111 | 0 |
| 0.8055555555555555 | 0 |
| 0.80625 | 0 |
| 0.8069444444444445 | 0 |
| 0.8076388888888889 | 0 |
| 0.8083333333333332 | 0 |
| 0.8090277777777778 | 0 |
| 0.8097222222222222 | 0 |
| 0.8104166666666667 | 0 |
| 0.811111111111111 | 0 |
| 0.8118055555555556 | 0 |
| 0.8125 | 0 |
| 0.8131944444444444 | 0 |
| 0.813888888888889 | 0 |
| 0.8145833333333333 | 0 |
| 0.8152777777777778 | 0 |
| 0.8159722222222222 | 0 |
| 0.8166666666666668 | 0 |
| 0.8173611111111111 | 0 |
| 0.8180555555555555 | 0 |
| 0.81875 | 0 |
| 0.8194444444444445 | 0 |
| 0.8201388888888889 | 0 |
| 0.8208333333333333 | 0 |
| 0.8215277777777777 | 0 |
| 0.8222222222222223 | 0 |
| 0.8229166666666666 | 0 |
| 0.8236111111111111 | 0 |
| 0.8243055555555556 | 0 |
| 0.8250000000000001 | 0 |
| 0.8256944444444444 | 0 |
| 0.8263888888888888 | 0 |
| 0.8270833333333334 | 0 |
| 0.8277777777777778 | 0 |
| 0.8284722222222222 | 0 |
| 0.8291666666666666 | 0 |
| 0.8298611111111112 | 0 |
| 0.8305555555555556 | 0 |
| 0.8312499999999999 | 0 |
| 0.8319444444444444 | 0 |
| 0.8326388888888889 | 0 |
| 0.8333333333333334 | 0 |
| 0.8340277777777777 | 0 |
| 0.8347222222222223 | 0 |
| 0.8354166666666667 | 0 |
| 0.8361111111111111 | 0 |
| 0.8368055555555555 | 0 |
| 0.8375 | 0 |
| 0.8381944444444445 | 0 |
| 0.8388888888888889 | 0 |
| 0.8395833333333332 | 0 |
| 0.8402777777777778 | 0 |
| 0.8409722222222222 | 0 |
| 0.8416666666666667 | 0 |
| 0.842361111111111 | 0 |
| 0.8430555555555556 | 0 |
| 0.84375 | 0 |
| 0.8444444444444444 | 0 |
| 0.845138888888889 | 0 |
| 0.8458333333333333 | 0 |
| 0.8465277777777778 | 0 |
| 0.8472222222222222 | 0 |
| 0.8479166666666668 | 0 |
| 0.8486111111111111 | 0 |
| 0.8493055555555555 | 0 |
| 0.85 | 0 |
| 0.8506944444444445 | 0 |
| 0.8513888888888889 | 0 |
| 0.8520833333333333 | 0 |
| 0.8527777777777777 | 0 |
| 0.8534722222222223 | 0 |
| 0.8541666666666666 | 0 |
| 0.8548611111111111 | 0 |
| 0.8555555555555556 | 0 |
| 0.8562500000000001 | 0 |
| 0.8569444444444444 | 0 |
| 0.8576388888888888 | 0 |
| 0.8583333333333334 | 0 |
| 0.8590277777777778 | 0 |
| 0.8597222222222222 | 0 |
| 0.8604166666666666 | 0 |
| 0.8611111111111112 | 0 |
| 0.8618055555555556 | 0 |
| 0.8624999999999999 | 0 |
| 0.8631944444444444 | 0 |
| 0.8638888888888889 | 0 |
| 0.8645833333333334 | 0 |
| 0.8652777777777777 | 0 |
| 0.8659722222222223 | 0 |
| 0.8666666666666667 | 0 |
| 0.8673611111111111 | 0 |
| 0.8680555555555555 | 0 |
| 0.86875 | 0 |
| 0.8694444444444445 | 0 |
| 0.8701388888888889 | 0 |
| 0.8708333333333332 | 0 |
| 0.8715277777777778 | 0 |
| 0.8722222222222222 | 0 |
| 0.8729166666666667 | 0 |
| 0.873611111111111 | 0 |
| 0.8743055555555556 | 0 |
| 0.875 | 0 |
| 0.8756944444444444 | 0 |
| 0.876388888888889 | 0 |
| 0.8770833333333333 | 0 |
| 0.8777777777777778 | 0 |
| 0.8784722222222222 | 0 |
| 0.8791666666666668 | 0 |
| 0.8798611111111111 | 0 |
| 0.8805555555555555 | 0 |
| 0.88125 | 0 |
| 0.8819444444444445 | 0 |
| 0.8826388888888889 | 0 |
| 0.8833333333333333 | 0 |
| 0.8840277777777777 | 0 |
| 0.8847222222222223 | 0 |
| 0.8854166666666666 | 0 |
| 0.8861111111111111 | 0 |
| 0.8868055555555556 | 0 |
| 0.8875000000000001 | 0 |
| 0.8881944444444444 | 0 |
| 0.8888888888888888 | 0 |
| 0.8895833333333334 | 0 |
| 0.8902777777777778 | 0 |
| 0.8909722222222222 | 0 |
| 0.8916666666666666 | 0 |
| 0.8923611111111112 | 0 |
| 0.8930555555555556 | 0 |
| 0.8937499999999999 | 0 |
| 0.8944444444444444 | 0 |
| 0.8951388888888889 | 0 |
| 0.8958333333333334 | 0 |
| 0.8965277777777777 | 0 |
| 0.8972222222222223 | 0 |
| 0.8979166666666667 | 0 |
| 0.8986111111111111 | 0 |
| 0.8993055555555555 | 0 |
| 0.9 | 0 |
| 0.9006944444444445 | 0 |
| 0.9013888888888889 | 0 |
| 0.9020833333333332 | 0 |
| 0.9027777777777778 | 0 |
| 0.9034722222222222 | 0 |
| 0.9041666666666667 | 0 |
| 0.904861111111111 | 0 |
| 0.9055555555555556 | 0 |
| 0.90625 | 0 |
| 0.9069444444444444 | 0 |
| 0.907638888888889 | 0 |
| 0.9083333333333333 | 0 |
| 0.9090277777777778 | 0 |
| 0.9097222222222222 | 0 |
| 0.9104166666666668 | 0 |
| 0.9111111111111111 | 0 |
| 0.9118055555555555 | 0 |
| 0.9125 | 0 |
| 0.9131944444444445 | 0 |
| 0.9138888888888889 | 0 |
| 0.9145833333333333 | 0 |
| 0.9152777777777777 | 0 |
| 0.9159722222222223 | 0 |
| 0.9166666666666666 | 0 |
| 0.9173611111111111 | 0 |
| 0.9180555555555556 | 0 |
| 0.9187500000000001 | 0 |
| 0.9194444444444444 | 0 |
| 0.9201388888888888 | 0 |
| 0.9208333333333334 | 0 |
| 0.9215277777777778 | 0 |
| 0.9222222222222222 | 0 |
| 0.9229166666666666 | 0 |
| 0.9236111111111112 | 0 |
| 0.9243055555555556 | 0 |
| 0.9249999999999999 | 0 |
| 0.9256944444444444 | 0 |
| 0.9263888888888889 | 0 |
| 0.9270833333333334 | 0 |
| 0.9277777777777777 | 0 |
| 0.9284722222222223 | 0 |
| 0.9291666666666667 | 0 |
| 0.9298611111111111 | 0 |
| 0.9305555555555555 | 0 |
| 0.93125 | 0 |
| 0.9319444444444445 | 0 |
| 0.9326388888888889 | 0 |
| 0.9333333333333332 | 0 |
| 0.9340277777777778 | 0 |
| 0.9347222222222222 | 0 |
| 0.9354166666666667 | 0 |
| 0.936111111111111 | 0 |
| 0.9368055555555556 | 0 |
| 0.9375 | 0 |
| 0.9381944444444444 | 0 |
| 0.938888888888889 | 0 |
| 0.9395833333333333 | 0 |
| 0.9402777777777778 | 0 |
| 0.9409722222222222 | 0 |
| 0.9416666666666668 | 0 |
| 0.9423611111111111 | 0 |
| 0.9430555555555555 | 0 |
| 0.94375 | 0 |
| 0.9444444444444445 | 0 |
| 0.9451388888888889 | 0 |
| 0.9458333333333333 | 0 |
| 0.9465277777777777 | 0 |
| 0.9472222222222223 | 0 |
| 0.9479166666666666 | 0 |
| 0.9486111111111111 | 0 |
| 0.9493055555555556 | 0 |
| 0.9500000000000001 | 0 |
| 0.9506944444444444 | 0 |
| 0.9513888888888888 | 0 |
| 0.9520833333333334 | 0 |
| 0.9527777777777778 | 0 |
| 0.9534722222222222 | 0 |
| 0.9541666666666666 | 0 |
| 0.9548611111111112 | 0 |
| 0.9555555555555556 | 0 |
| 0.9562499999999999 | 0 |
| 0.9569444444444444 | 0 |
| 0.9576388888888889 | 0 |
| 0.9583333333333334 | 0 |
| 0.9590277777777777 | 0 |
| 0.9597222222222223 | 0 |
| 0.9604166666666667 | 0 |
| 0.9611111111111111 | 0 |
| 0.9618055555555555 | 0 |
| 0.9625 | 0 |
| 0.9631944444444445 | 0 |
| 0.9638888888888889 | 0 |
| 0.9645833333333332 | 0 |
| 0.9652777777777778 | 0 |
| 0.9659722222222222 | 0 |
| 0.9666666666666667 | 0 |
| 0.967361111111111 | 0 |
| 0.9680555555555556 | 0 |
| 0.96875 | 0 |
| 0.9694444444444444 | 0 |
| 0.970138888888889 | 0 |
| 0.9708333333333333 | 0 |
| 0.9715277777777778 | 0 |
| 0.9722222222222222 | 0 |
| 0.9729166666666668 | 0 |
| 0.9736111111111111 | 0 |
| 0.9743055555555555 | 0 |
| 0.975 | 0 |
| 0.9756944444444445 | 0 |
| 0.9763888888888889 | 0 |
| 0.9770833333333333 | 0 |
| 0.9777777777777777 | 0 |
| 0.9784722222222223 | 0 |
| 0.9791666666666666 | 0 |
| 0.9798611111111111 | 0 |
| 0.9805555555555556 | 0 |
| 0.9812500000000001 | 0 |
| 0.9819444444444444 | 0 |
| 0.9826388888888888 | 0 |
| 0.9833333333333334 | 0 |
| 0.9840277777777778 | 0 |
| 0.9847222222222222 | 0 |
| 0.9854166666666666 | 0 |
| 0.9861111111111112 | 0 |
| 0.9868055555555556 | 0 |
| 0.9874999999999999 | 0 |
| 0.9881944444444444 | 0 |
| 0.9888888888888889 | 0 |
| 0.9895833333333334 | 0 |
| 0.9902777777777777 | 0 |
| 0.9909722222222223 | 0 |
| 0.9916666666666667 | 0 |
| 0.9923611111111111 | 0 |
| 0.9930555555555555 | 0 |
| 0.99375 | 0 |
| 0.9944444444444445 | 0 |
| 0.9951388888888889 | 0 |
| 0.9958333333333332 | 0 |
| 0.9965277777777778 | 0 |
| 0.9972222222222222 | 0 |
| 0.9979166666666667 | 0 |
| 0.998611111111111 | 0 |
| 0.9993055555555556 | 0 |